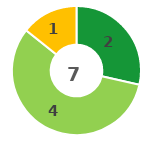
| Category | Series 0 |
|---|---|
| 0 | 2 |
| 1 | 4 |
| 2 | 1 |
| 3 | 0 |
| 4 | 0 |